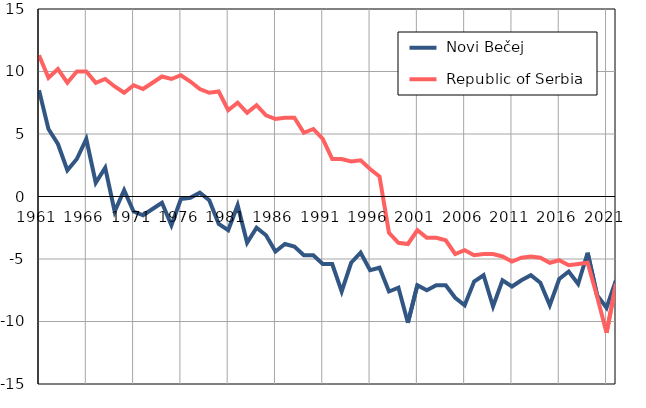
| Category |  Novi Bečej |  Republic of Serbia |
|---|---|---|
| 1961.0 | 8.5 | 11.3 |
| 1962.0 | 5.4 | 9.5 |
| 1963.0 | 4.2 | 10.2 |
| 1964.0 | 2.1 | 9.1 |
| 1965.0 | 3 | 10 |
| 1966.0 | 4.6 | 10 |
| 1967.0 | 1.1 | 9.1 |
| 1968.0 | 2.3 | 9.4 |
| 1969.0 | -1.2 | 8.8 |
| 1970.0 | 0.5 | 8.3 |
| 1971.0 | -1.2 | 8.9 |
| 1972.0 | -1.5 | 8.6 |
| 1973.0 | -1 | 9.1 |
| 1974.0 | -0.5 | 9.6 |
| 1975.0 | -2.3 | 9.4 |
| 1976.0 | -0.2 | 9.7 |
| 1977.0 | -0.1 | 9.2 |
| 1978.0 | 0.3 | 8.6 |
| 1979.0 | -0.3 | 8.3 |
| 1980.0 | -2.2 | 8.4 |
| 1981.0 | -2.7 | 6.9 |
| 1982.0 | -0.7 | 7.5 |
| 1983.0 | -3.7 | 6.7 |
| 1984.0 | -2.5 | 7.3 |
| 1985.0 | -3.1 | 6.5 |
| 1986.0 | -4.4 | 6.2 |
| 1987.0 | -3.8 | 6.3 |
| 1988.0 | -4 | 6.3 |
| 1989.0 | -4.7 | 5.1 |
| 1990.0 | -4.7 | 5.4 |
| 1991.0 | -5.4 | 4.6 |
| 1992.0 | -5.4 | 3 |
| 1993.0 | -7.6 | 3 |
| 1994.0 | -5.3 | 2.8 |
| 1995.0 | -4.5 | 2.9 |
| 1996.0 | -5.9 | 2.2 |
| 1997.0 | -5.7 | 1.6 |
| 1998.0 | -7.6 | -2.9 |
| 1999.0 | -7.3 | -3.7 |
| 2000.0 | -10.1 | -3.8 |
| 2001.0 | -7.1 | -2.7 |
| 2002.0 | -7.5 | -3.3 |
| 2003.0 | -7.1 | -3.3 |
| 2004.0 | -7.1 | -3.5 |
| 2005.0 | -8.1 | -4.6 |
| 2006.0 | -8.7 | -4.3 |
| 2007.0 | -6.8 | -4.7 |
| 2008.0 | -6.3 | -4.6 |
| 2009.0 | -8.8 | -4.6 |
| 2010.0 | -6.7 | -4.8 |
| 2011.0 | -7.2 | -5.2 |
| 2012.0 | -6.7 | -4.9 |
| 2013.0 | -6.3 | -4.8 |
| 2014.0 | -6.9 | -4.9 |
| 2015.0 | -8.7 | -5.3 |
| 2016.0 | -6.6 | -5.1 |
| 2017.0 | -6 | -5.5 |
| 2018.0 | -7 | -5.4 |
| 2019.0 | -4.5 | -5.3 |
| 2020.0 | -7.9 | -8 |
| 2021.0 | -8.9 | -10.9 |
| 2022.0 | -6.7 | -7 |